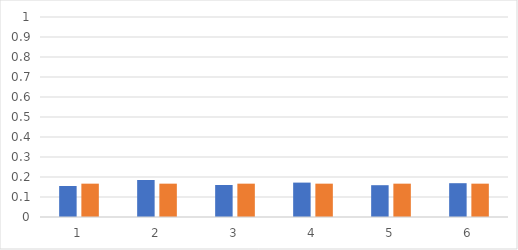
| Category | rel gyak | vsz |
|---|---|---|
| 0 | 0.155 | 0.167 |
| 1 | 0.185 | 0.167 |
| 2 | 0.16 | 0.167 |
| 3 | 0.172 | 0.167 |
| 4 | 0.159 | 0.167 |
| 5 | 0.169 | 0.167 |